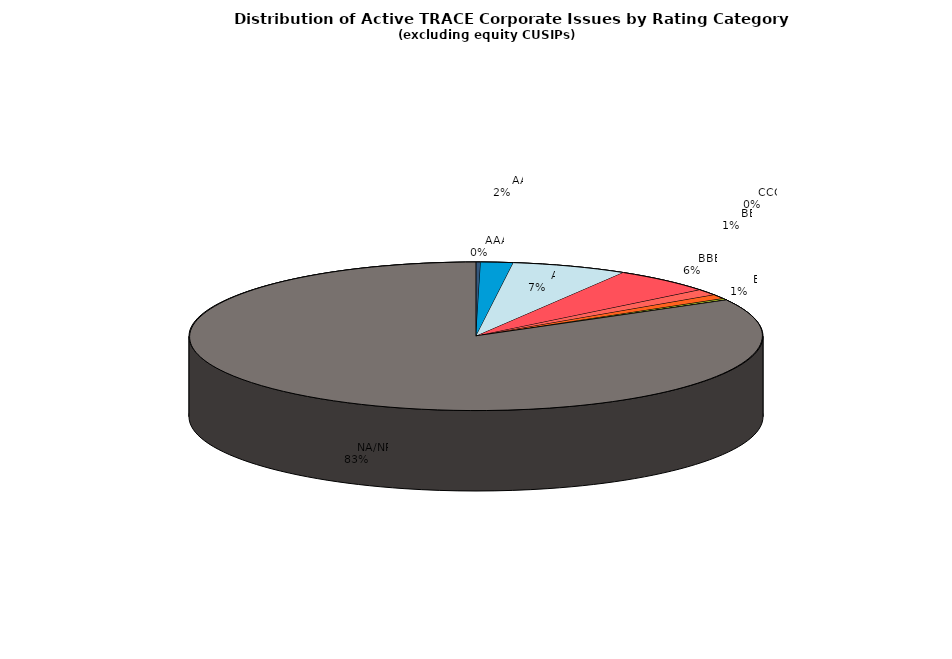
| Category | Series 0 |
|---|---|
|         AAA | 616 |
|         AA | 4249 |
|         A | 15234 |
|         BBB | 13224 |
|         BB | 3137 |
|         B | 2190 |
|         CCC | 776 |
|         CC | 63 |
|         C | 13 |
|         D | 44 |
|         NA/NR | 194130 |